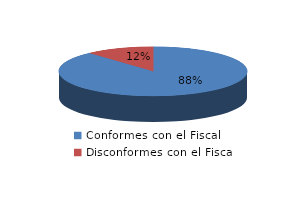
| Category | Series 0 |
|---|---|
| 0 | 53 |
| 1 | 7 |